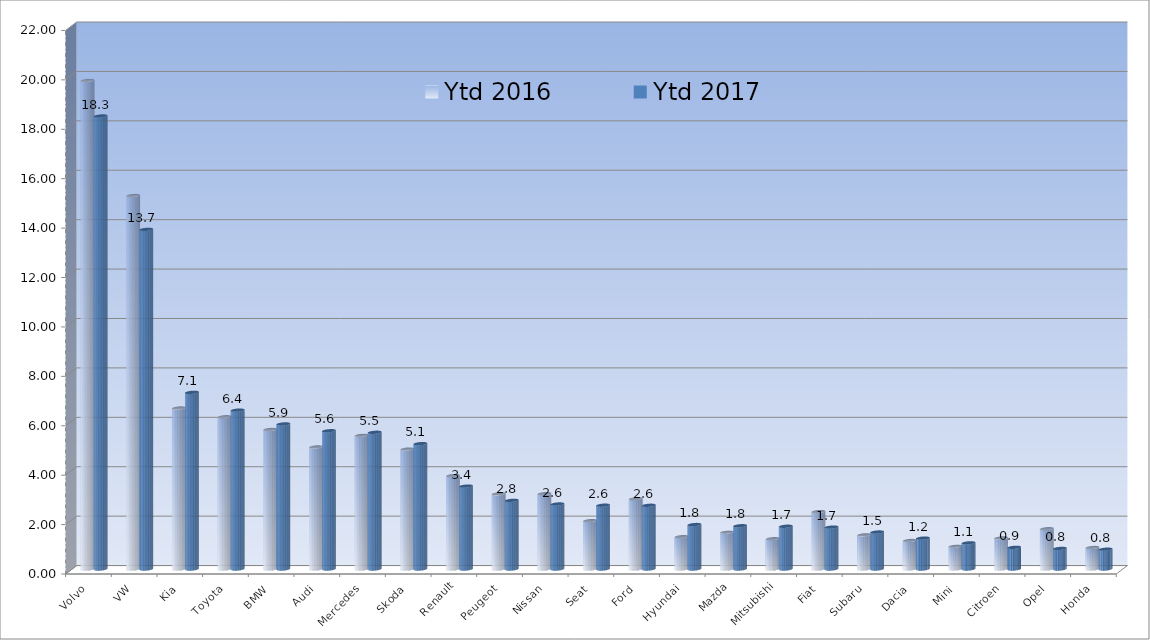
| Category | Ytd 2016 | Ytd 2017 |
|---|---|---|
| Volvo | 19.773 | 18.336 |
| VW | 15.116 | 13.747 |
| Kia | 6.515 | 7.149 |
| Toyota | 6.161 | 6.43 |
| BMW | 5.648 | 5.87 |
| Audi | 4.939 | 5.596 |
| Mercedes | 5.409 | 5.533 |
| Skoda | 4.853 | 5.073 |
| Renault | 3.779 | 3.355 |
| Peugeot | 3.039 | 2.778 |
| Nissan | 3.047 | 2.63 |
| Seat | 1.955 | 2.582 |
| Ford | 2.841 | 2.579 |
| Hyundai | 1.307 | 1.799 |
| Mazda | 1.488 | 1.75 |
| Mitsubishi | 1.226 | 1.73 |
| Fiat | 2.323 | 1.696 |
| Subaru | 1.381 | 1.496 |
| Dacia | 1.154 | 1.249 |
| Mini | 0.919 | 1.058 |
| Citroen | 1.255 | 0.877 |
| Opel | 1.629 | 0.833 |
| Honda | 0.869 | 0.802 |